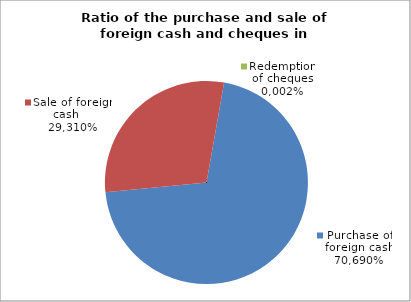
| Category | Purchase of foreign cash |
|---|---|
| 0 | 0.707 |
| 1 | 0.293 |
| 2 | 0 |